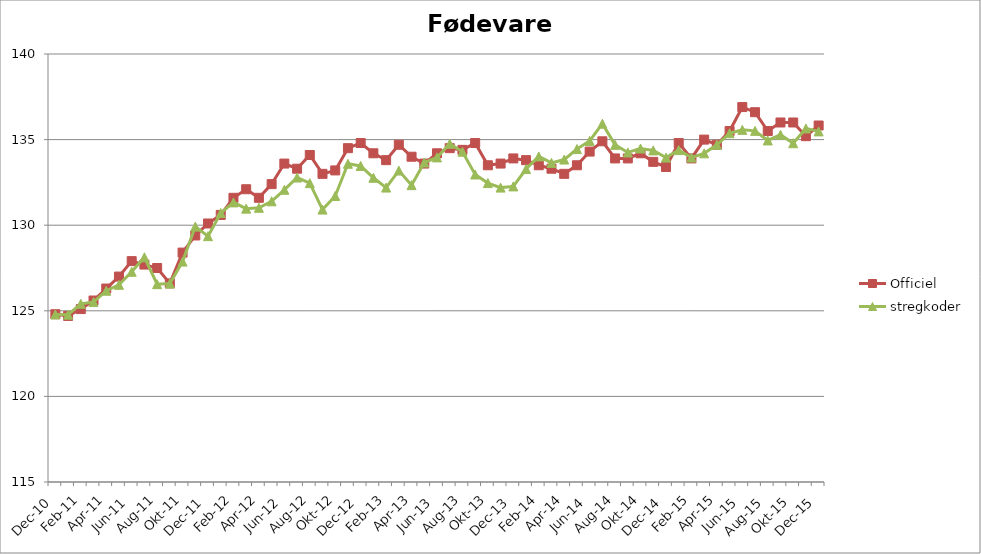
| Category | Officiel | stregkoder |
|---|---|---|
|  Dec-10 | 124.8 | 124.79 |
|  Jan-11 | 124.7 | 124.773 |
|  Feb-11 | 125.1 | 125.407 |
|  Mar-11 | 125.6 | 125.511 |
|  Apr-11 | 126.3 | 126.172 |
|  Maj-11 | 127 | 126.518 |
|  Jun-11 | 127.9 | 127.278 |
|  Jul-11 | 127.7 | 128.125 |
|  Aug-11 | 127.5 | 126.556 |
|  Sep-11 | 126.6 | 126.589 |
|  Okt-11 | 128.4 | 127.874 |
|  Nov-11 | 129.4 | 129.919 |
|  Dec-11 | 130.1 | 129.359 |
|  Jan-12 | 130.6 | 130.711 |
|  Feb-12 | 131.6 | 131.333 |
|  Mar-12 | 132.1 | 130.968 |
|  Apr-12 | 131.6 | 131.016 |
|  Maj-12 | 132.4 | 131.395 |
|  Jun-12 | 133.6 | 132.068 |
|  Jul-12 | 133.3 | 132.784 |
|  Aug-12 | 134.1 | 132.457 |
|  Sep-12 | 133 | 130.912 |
|  Okt-12 | 133.2 | 131.705 |
|  Nov-12 | 134.5 | 133.587 |
|  Dec-12 | 134.8 | 133.461 |
|  Jan-13 | 134.2 | 132.77 |
|  Feb-13 | 133.8 | 132.197 |
|  Mar-13 | 134.7 | 133.192 |
|  Apr-13 | 134 | 132.341 |
|  Maj-13 | 133.6 | 133.662 |
|  Jun-13 | 134.2 | 133.96 |
|  Jul-13 | 134.5 | 134.756 |
|  Aug-13 | 134.4 | 134.291 |
|  Sep-13 | 134.8 | 132.961 |
|  Okt-13 | 133.5 | 132.461 |
|  Nov-13 | 133.6 | 132.196 |
|  Dec-13 | 133.9 | 132.267 |
|  Jan-14 | 133.8 | 133.28 |
|  Feb-14 | 133.5 | 134.017 |
|  Mar-14 | 133.3 | 133.639 |
|  Apr-14 | 133 | 133.836 |
|  Maj-14 | 133.5 | 134.448 |
|  Jun-14 | 134.3 | 134.922 |
|  Jul-14 | 134.9 | 135.93 |
|  Aug-14 | 133.9 | 134.693 |
|  Sep-14 | 133.9 | 134.249 |
|  Okt-14 | 134.2 | 134.479 |
|  Nov-14 | 133.7 | 134.369 |
|  Dec-14 | 133.4 | 133.951 |
|  Jan-15 | 134.8 | 134.387 |
|  Feb-15 | 133.9 | 133.953 |
|  Mar-15 | 135 | 134.197 |
|  Apr-15 | 134.7 | 134.697 |
|  Maj-15 | 135.5 | 135.372 |
| Jun-15 | 136.9 | 135.57 |
| Jul-15 | 136.6 | 135.51 |
| Aug-15 | 135.5 | 134.951 |
| Sep-15 | 136 | 135.282 |
| Okt-15 | 136 | 134.789 |
| Nov-15 | 135.2 | 135.65 |
| Dec-15 | 135.823 | 135.478 |